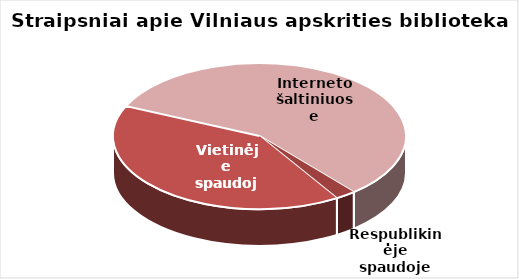
| Category | Series 0 |
|---|---|
| Respublikinėje spaudoje | 39 |
| Vietinėje spaudoje | 702 |
| Interneto šaltiniuose | 989 |